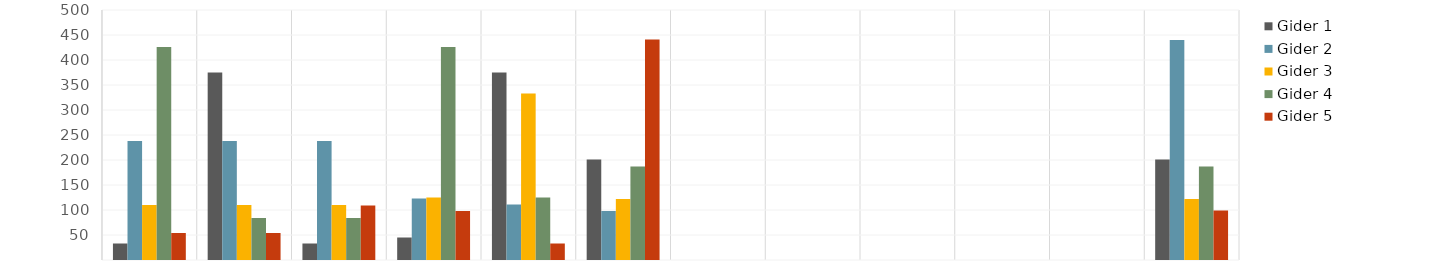
| Category | Gider 1 | Gider 2 | Gider 3 | Gider 4 | Gider 5 |
|---|---|---|---|---|---|
| Oca | 33 | 238 | 110 | 426 | 54 |
| Şub | 375 | 238 | 110 | 84 | 54 |
| Mar | 33 | 238 | 110 | 84 | 109 |
| Nis | 45 | 123 | 125 | 426 | 98 |
| May | 375 | 111 | 333 | 125 | 33 |
| Haz | 201 | 98 | 122 | 187 | 441 |
| Tem | 0 | 0 | 0 | 0 | 0 |
| Ağu | 0 | 0 | 0 | 0 | 0 |
| Eyl | 0 | 0 | 0 | 0 | 0 |
| Eki | 0 | 0 | 0 | 0 | 0 |
| Kas | 0 | 0 | 0 | 0 | 0 |
| Ara | 201 | 440 | 122 | 187 | 99 |